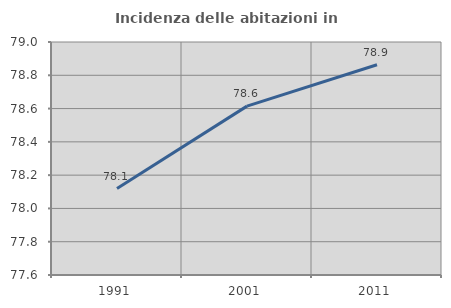
| Category | Incidenza delle abitazioni in proprietà  |
|---|---|
| 1991.0 | 78.119 |
| 2001.0 | 78.615 |
| 2011.0 | 78.864 |